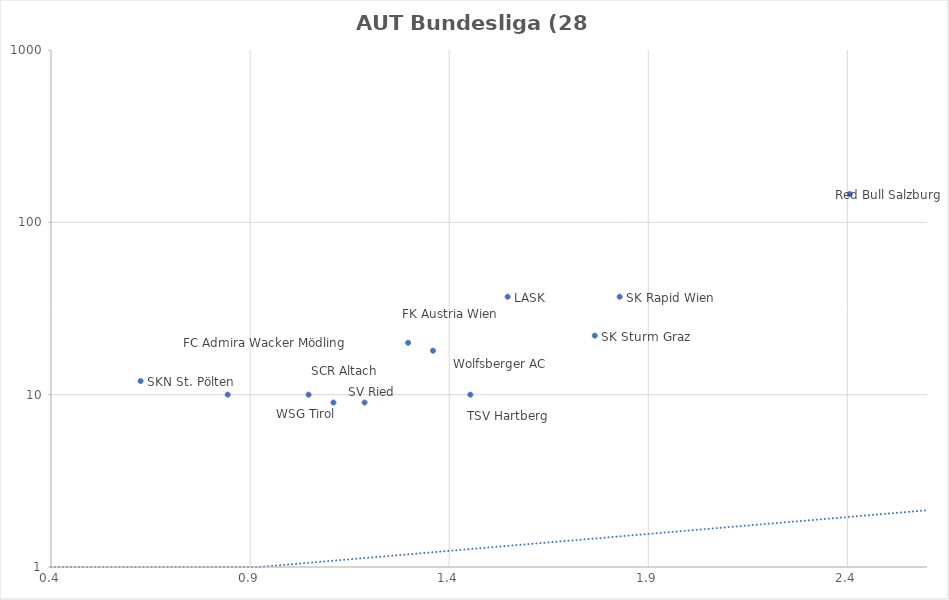
| Category | Series 0 |
|---|---|
| 2.40625 | 146 |
| 1.828125 | 37 |
| 1.765625 | 22 |
| 1.546875 | 37 |
| 1.359375 | 18 |
| 1.1875 | 9 |
| 1.453125 | 10 |
| 1.296875 | 20 |
| 1.109375 | 9 |
| 1.046875 | 10 |
| 0.84375 | 10 |
| 0.625 | 12 |